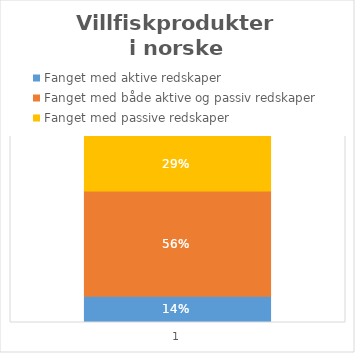
| Category | Fanget med aktive redskaper | Fanget med både aktive og passiv redskaper | Fanget med passive redskaper |
|---|---|---|---|
| 0 | 0.14 | 0.56 | 0.29 |